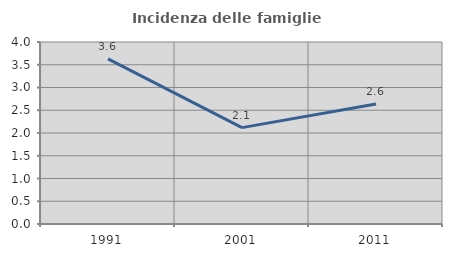
| Category | Incidenza delle famiglie numerose |
|---|---|
| 1991.0 | 3.629 |
| 2001.0 | 2.118 |
| 2011.0 | 2.636 |